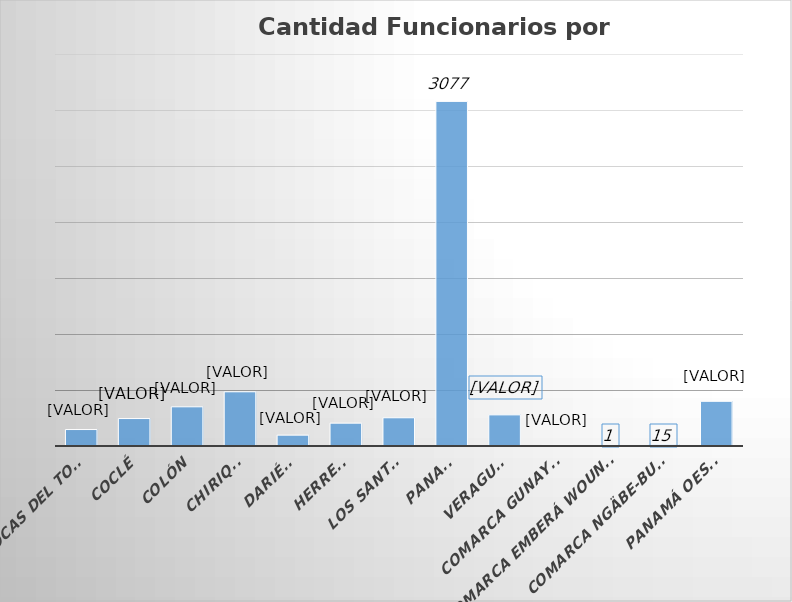
| Category | Cantidad  |
|---|---|
| BOCAS DEL TORO | 147 |
| COCLÉ | 245 |
| COLÓN | 350 |
| CHIRIQUÍ | 484 |
| DARIÉN | 97 |
| HERRERA | 204 |
| LOS SANTOS | 252 |
| PANAMÁ | 3077 |
| VERAGUAS | 278 |
| COMARCA GUNAYALA | 7 |
| COMARCA EMBERÁ WOUNAAN | 1 |
| COMARCA NGÄBE-BUGLÉ | 15 |
| PANAMÁ OESTE | 399 |